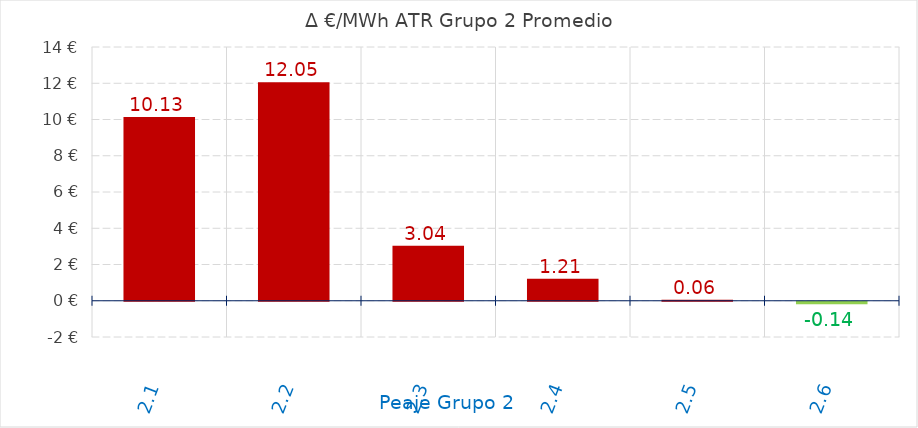
| Category | D €/MWh |
|---|---|
| 2.1 | 10.134 |
| 2.2 | 12.053 |
| 2.3 | 3.04 |
| 2.4 | 1.207 |
| 2.5 | 0.061 |
| 2.6 | -0.143 |